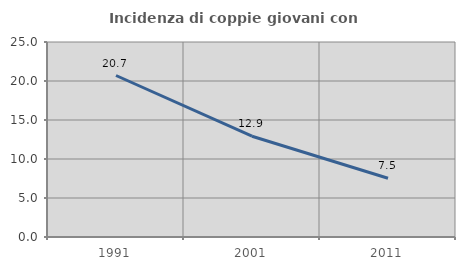
| Category | Incidenza di coppie giovani con figli |
|---|---|
| 1991.0 | 20.705 |
| 2001.0 | 12.922 |
| 2011.0 | 7.536 |